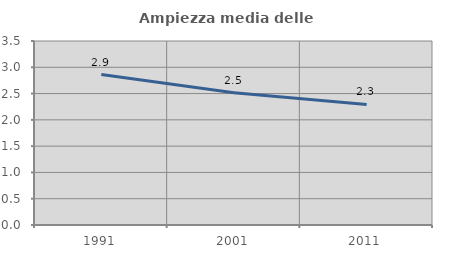
| Category | Ampiezza media delle famiglie |
|---|---|
| 1991.0 | 2.861 |
| 2001.0 | 2.515 |
| 2011.0 | 2.293 |